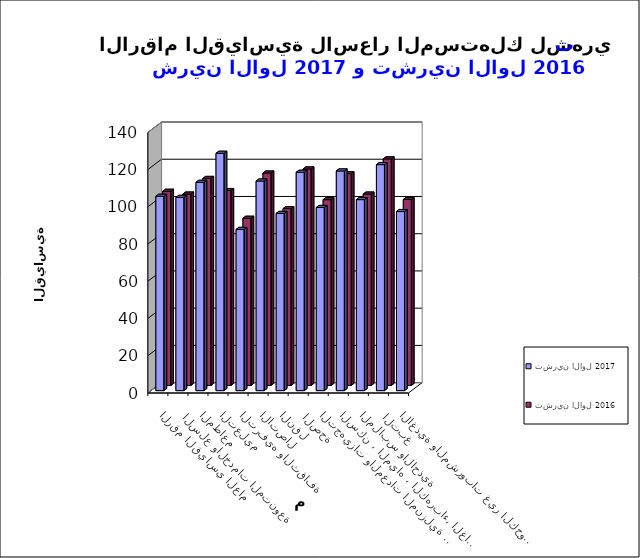
| Category | تشرين الاول 2017      | تشرين الاول 2016 |
|---|---|---|
| الاغذية والمشروبات غير الكحولية | 96.2 | 99.9 |
|  التبغ | 121.4 | 121.7 |
| الملابس والاحذية | 102.6 | 102.8 |
| السكن ، المياه ، الكهرباء، الغاز  | 118 | 113.8 |
| التجهيزات والمعدات المنزلية والصيانة | 98.4 | 99.8 |
|  الصحة | 117.3 | 116.3 |
| النقل | 95.2 | 95 |
| الاتصال | 112.6 | 114.1 |
| الترفيه والثقافة | 86.6 | 89.8 |
| التعليم | 127.5 | 104.7 |
| المطاعم  | 111.9 | 111.2 |
|  السلع والخدمات المتنوعة | 103.8 | 102.8 |
| الرقم القياسي العام | 104.4 | 104.3 |